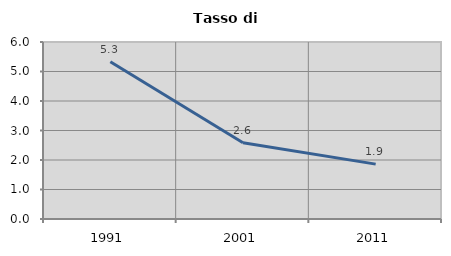
| Category | Tasso di disoccupazione   |
|---|---|
| 1991.0 | 5.328 |
| 2001.0 | 2.586 |
| 2011.0 | 1.86 |